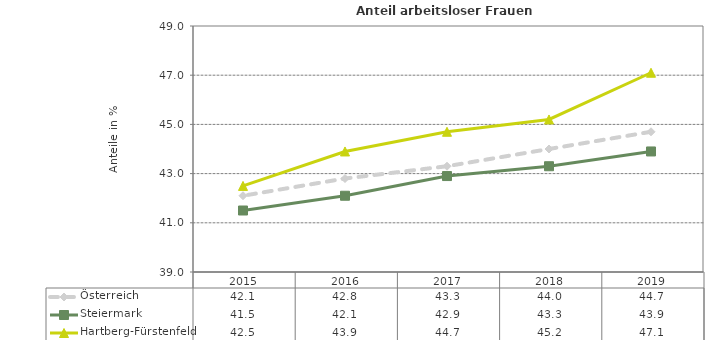
| Category | Österreich | Steiermark | Hartberg-Fürstenfeld |
|---|---|---|---|
| 2019.0 | 44.7 | 43.9 | 47.1 |
| 2018.0 | 44 | 43.3 | 45.2 |
| 2017.0 | 43.3 | 42.9 | 44.7 |
| 2016.0 | 42.8 | 42.1 | 43.9 |
| 2015.0 | 42.1 | 41.5 | 42.5 |